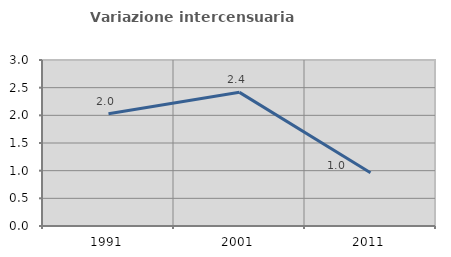
| Category | Variazione intercensuaria annua |
|---|---|
| 1991.0 | 2.03 |
| 2001.0 | 2.415 |
| 2011.0 | 0.962 |